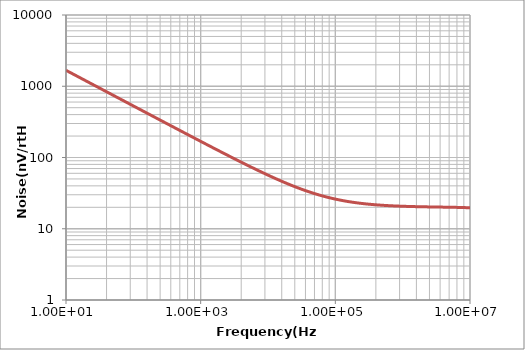
| Category | Low Pass Filter |
|---|---|
| 10.0 | 1673.44 |
| 10.373 | 1643.081 |
| 10.932 | 1600.527 |
| 11.304 | 1573.976 |
| 11.863 | 1536.45 |
| 12.422 | 1501.488 |
| 13.168 | 1458.344 |
| 13.727 | 1428.347 |
| 14.286 | 1400.129 |
| 15.031 | 1364.997 |
| 15.776 | 1332.384 |
| 16.522 | 1301.964 |
| 17.267 | 1273.574 |
| 18.012 | 1246.964 |
| 18.944 | 1215.911 |
| 19.876 | 1187.07 |
| 20.807 | 1160.216 |
| 21.739 | 1135.08 |
| 22.857 | 1106.981 |
| 23.975 | 1080.872 |
| 25.093 | 1056.527 |
| 26.211 | 1033.757 |
| 27.516 | 1008.955 |
| 28.82 | 985.874 |
| 30.124 | 964.309 |
| 31.615 | 941.305 |
| 33.106 | 919.874 |
| 34.596 | 899.857 |
| 36.273 | 878.82 |
| 37.95 | 859.193 |
| 39.627 | 840.826 |
| 41.677 | 819.898 |
| 43.54 | 802.176 |
| 45.59 | 783.945 |
| 47.826 | 765.412 |
| 50.062 | 748.135 |
| 52.298 | 731.979 |
| 54.907 | 714.39 |
| 57.516 | 698.012 |
| 60.124 | 682.718 |
| 62.919 | 667.395 |
| 65.901 | 652.135 |
| 69.068 | 637.022 |
| 72.422 | 622.112 |
| 75.776 | 608.202 |
| 79.317 | 594.486 |
| 83.043 | 581.012 |
| 86.957 | 567.801 |
| 91.056 | 554.89 |
| 95.342 | 542.291 |
| 100.0 | 529.528 |
| 104.478 | 518.072 |
| 108.955 | 507.333 |
| 113.433 | 497.234 |
| 119.403 | 484.665 |
| 125.373 | 473.005 |
| 131.343 | 462.15 |
| 137.313 | 452.011 |
| 143.284 | 442.511 |
| 150.746 | 431.443 |
| 158.209 | 421.166 |
| 165.672 | 411.593 |
| 173.134 | 402.647 |
| 180.597 | 394.26 |
| 189.552 | 384.859 |
| 198.507 | 376.102 |
| 207.463 | 367.918 |
| 217.91 | 359.017 |
| 228.358 | 350.734 |
| 238.806 | 343.001 |
| 250.746 | 334.764 |
| 262.687 | 327.094 |
| 274.627 | 319.932 |
| 288.06 | 312.413 |
| 301.493 | 305.403 |
| 314.925 | 298.848 |
| 329.851 | 292.039 |
| 346.269 | 285.065 |
| 362.687 | 278.571 |
| 379.104 | 272.504 |
| 397.015 | 266.32 |
| 416.418 | 260.077 |
| 435.821 | 254.257 |
| 456.716 | 248.409 |
| 477.612 | 242.951 |
| 500.0 | 237.487 |
| 523.881 | 232.05 |
| 549.254 | 226.668 |
| 574.627 | 221.647 |
| 601.493 | 216.681 |
| 629.851 | 211.79 |
| 659.701 | 206.987 |
| 691.045 | 202.283 |
| 723.881 | 197.688 |
| 758.209 | 193.207 |
| 794.03 | 188.847 |
| 831.343 | 184.609 |
| 870.149 | 180.495 |
| 911.94 | 176.363 |
| 953.731 | 172.506 |
| 1000.0 | 168.523 |
| 1023.87 | 166.575 |
| 1095.49 | 161.119 |
| 1143.24 | 157.771 |
| 1190.98 | 154.629 |
| 1238.73 | 151.67 |
| 1310.35 | 147.541 |
| 1358.09 | 144.973 |
| 1429.71 | 141.366 |
| 1501.33 | 138.022 |
| 1572.94 | 134.911 |
| 1644.56 | 132.007 |
| 1716.18 | 129.288 |
| 1811.67 | 125.918 |
| 1883.29 | 123.562 |
| 1978.78 | 120.624 |
| 2074.27 | 117.893 |
| 2169.76 | 115.346 |
| 2289.12 | 112.391 |
| 2384.61 | 110.191 |
| 2503.98 | 107.621 |
| 2623.34 | 105.23 |
| 2742.71 | 102.999 |
| 2862.07 | 100.911 |
| 3005.3 | 98.574 |
| 3148.54 | 96.4 |
| 3291.78 | 94.372 |
| 3458.89 | 92.169 |
| 3625.99 | 90.122 |
| 3793.1 | 88.215 |
| 3960.21 | 86.431 |
| 4151.19 | 84.528 |
| 4342.18 | 82.755 |
| 4557.03 | 80.897 |
| 4771.88 | 79.169 |
| 5010.61 | 77.383 |
| 5225.46 | 75.884 |
| 5488.06 | 74.175 |
| 5750.66 | 72.588 |
| 6013.26 | 71.108 |
| 6299.73 | 69.603 |
| 6586.21 | 68.2 |
| 6896.55 | 66.783 |
| 7230.77 | 65.363 |
| 7564.99 | 64.041 |
| 7923.08 | 62.721 |
| 8305.04 | 61.412 |
| 8687.0 | 60.193 |
| 9116.71 | 58.918 |
| 9546.42 | 57.732 |
| 10000.0 | 56.569 |
| 10382.2 | 55.65 |
| 10955.4 | 54.367 |
| 11337.6 | 53.569 |
| 11910.8 | 52.448 |
| 12484.1 | 51.409 |
| 13057.3 | 50.442 |
| 13630.6 | 49.54 |
| 14394.9 | 48.427 |
| 14968.2 | 47.651 |
| 15732.5 | 46.688 |
| 16496.8 | 45.796 |
| 17261.1 | 44.968 |
| 18025.5 | 44.197 |
| 18980.9 | 43.303 |
| 19936.3 | 42.479 |
| 20891.7 | 41.716 |
| 21847.1 | 41.008 |
| 22802.5 | 40.348 |
| 23949.0 | 39.613 |
| 25095.5 | 38.932 |
| 26242.0 | 38.301 |
| 27388.5 | 37.714 |
| 28726.1 | 37.077 |
| 30063.7 | 36.488 |
| 31592.4 | 35.865 |
| 32929.9 | 35.359 |
| 34649.7 | 34.758 |
| 36178.3 | 34.263 |
| 37898.1 | 33.746 |
| 39808.9 | 33.217 |
| 41528.7 | 32.775 |
| 43630.6 | 32.276 |
| 45541.4 | 31.856 |
| 47834.4 | 31.39 |
| 49936.3 | 30.995 |
| 52420.4 | 30.564 |
| 54904.5 | 30.166 |
| 57388.5 | 29.798 |
| 60254.8 | 29.406 |
| 62929.9 | 29.068 |
| 65987.3 | 28.711 |
| 69044.6 | 28.382 |
| 72293.0 | 28.059 |
| 75732.5 | 27.744 |
| 79363.1 | 27.437 |
| 82993.6 | 27.155 |
| 87006.4 | 26.867 |
| 91019.1 | 26.601 |
| 95414.0 | 26.334 |
| 100000.0 | 26.077 |
| 104584.0 | 25.84 |
| 109168.0 | 25.622 |
| 113752.0 | 25.419 |
| 119864.0 | 25.171 |
| 124448.0 | 25 |
| 130560.0 | 24.788 |
| 136672.0 | 24.594 |
| 144312.0 | 24.373 |
| 150424.0 | 24.21 |
| 158065.0 | 24.024 |
| 165705.0 | 23.853 |
| 173345.0 | 23.696 |
| 180985.0 | 23.552 |
| 190153.0 | 23.393 |
| 199321.0 | 23.248 |
| 208489.0 | 23.115 |
| 217657.0 | 22.992 |
| 228353.0 | 22.861 |
| 239049.0 | 22.74 |
| 249745.0 | 22.63 |
| 261969.0 | 22.514 |
| 274194.0 | 22.408 |
| 287946.0 | 22.299 |
| 301698.0 | 22.199 |
| 315450.0 | 22.108 |
| 330730.0 | 22.015 |
| 346010.0 | 21.929 |
| 362818.0 | 21.844 |
| 379626.0 | 21.765 |
| 397963.0 | 21.687 |
| 416299.0 | 21.615 |
| 436163.0 | 21.544 |
| 456027.0 | 21.479 |
| 477419.0 | 21.415 |
| 500340.0 | 21.352 |
| 524788.0 | 21.291 |
| 549236.0 | 21.235 |
| 575212.0 | 21.181 |
| 601188.0 | 21.131 |
| 630221.0 | 21.08 |
| 659253.0 | 21.033 |
| 691341.0 | 20.986 |
| 723430.0 | 20.943 |
| 758574.0 | 20.9 |
| 793718.0 | 20.861 |
| 830390.0 | 20.823 |
| 870119.0 | 20.786 |
| 911375.0 | 20.75 |
| 954160.0 | 20.717 |
| 1000000.0 | 20.684 |
| 1047130.0 | 20.653 |
| 1096480.0 | 20.624 |
| 1148150.0 | 20.595 |
| 1202260.0 | 20.568 |
| 1258930.0 | 20.542 |
| 1318260.0 | 20.517 |
| 1380380.0 | 20.493 |
| 1445440.0 | 20.47 |
| 1513560.0 | 20.448 |
| 1584890.0 | 20.427 |
| 1659590.0 | 20.406 |
| 1737800.0 | 20.387 |
| 1819700.0 | 20.368 |
| 1905460.0 | 20.349 |
| 1995260.0 | 20.332 |
| 2089300.0 | 20.315 |
| 2187760.0 | 20.298 |
| 2290870.0 | 20.282 |
| 2398830.0 | 20.266 |
| 2511890.0 | 20.251 |
| 2630270.0 | 20.236 |
| 2754230.0 | 20.222 |
| 2884030.0 | 20.208 |
| 3019950.0 | 20.194 |
| 3162280.0 | 20.18 |
| 3311310.0 | 20.166 |
| 3467370.0 | 20.152 |
| 3630780.0 | 20.139 |
| 3801890.0 | 20.125 |
| 3981070.0 | 20.111 |
| 4168690.0 | 20.097 |
| 4365160.0 | 20.083 |
| 4570880.0 | 20.069 |
| 4786300.0 | 20.054 |
| 5011870.0 | 20.039 |
| 5248070.0 | 20.023 |
| 5495410.0 | 20.007 |
| 5754400.0 | 19.989 |
| 6025600.0 | 19.971 |
| 6309570.0 | 19.952 |
| 6606930.0 | 19.932 |
| 6918310.0 | 19.911 |
| 7244360.0 | 19.889 |
| 7585780.0 | 19.865 |
| 7943280.0 | 19.839 |
| 8317640.0 | 19.812 |
| 8709640.0 | 19.782 |
| 9120110.0 | 19.751 |
| 9549930.0 | 19.717 |
| 10000000.0 | 19.68 |
| 10471300.0 | 19.641 |
| 10964800.0 | 19.598 |
| 11481500.0 | 19.552 |
| 12022600.0 | 19.502 |
| 12589300.0 | 19.449 |
| 13182600.0 | 19.39 |
| 13803800.0 | 19.328 |
| 14454400.0 | 19.26 |
| 15135600.0 | 19.186 |
| 15848900.0 | 19.107 |
| 16595900.0 | 19.022 |
| 17378000.0 | 18.93 |
| 18197000.0 | 18.83 |
| 19054600.0 | 18.723 |
| 19952600.0 | 18.608 |
| 20893000.0 | 18.485 |
| 21877600.0 | 18.352 |
| 22908700.0 | 18.21 |
| 23988300.0 | 18.058 |
| 25118900.0 | 17.896 |
| 26302700.0 | 17.724 |
| 27542300.0 | 17.54 |
| 28840300.0 | 17.346 |
| 30199500.0 | 17.139 |
| 31622800.0 | 16.922 |
| 33113100.0 | 16.692 |
| 34673700.0 | 16.451 |
| 36307800.0 | 16.199 |
| 38018900.0 | 15.935 |
| 39810700.0 | 15.66 |
| 41686900.0 | 15.374 |
| 43651600.0 | 15.078 |
| 45708800.0 | 14.773 |
| 47863000.0 | 14.458 |
| 50118700.0 | 14.135 |
| 52480700.0 | 13.805 |
| 54954100.0 | 13.468 |
| 57544000.0 | 13.126 |
| 60256000.0 | 12.779 |
| 63095700.0 | 12.428 |
| 66069300.0 | 12.075 |
| 69183100.0 | 11.721 |
| 72443600.0 | 11.366 |
| 75857800.0 | 11.012 |
| 79432800.0 | 10.659 |
| 83176400.0 | 10.309 |
| 87096400.0 | 9.961 |
| 91201100.0 | 9.618 |
| 95499300.0 | 9.28 |
| 100000000.0 | 8.947 |